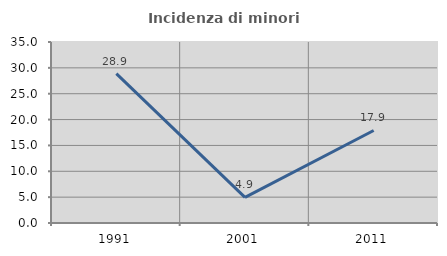
| Category | Incidenza di minori stranieri |
|---|---|
| 1991.0 | 28.889 |
| 2001.0 | 4.945 |
| 2011.0 | 17.892 |